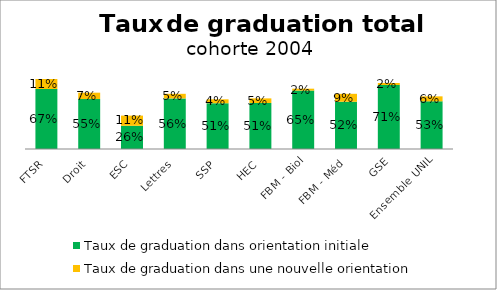
| Category | Taux de graduation dans orientation initiale | Taux de graduation dans une nouvelle orientation |
|---|---|---|
| FTSR | 0.667 | 0.111 |
| Droit | 0.555 | 0.071 |
| ESC | 0.258 | 0.113 |
| Lettres | 0.562 | 0.051 |
| SSP | 0.509 | 0.043 |
| HEC | 0.511 | 0.051 |
| FBM - Biol | 0.649 | 0.021 |
| FBM - Méd | 0.525 | 0.088 |
| GSE | 0.711 | 0.022 |
| Ensemble UNIL | 0.53 | 0.055 |